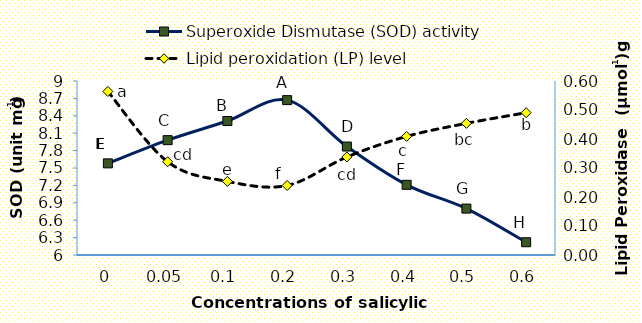
| Category | Superoxide Dismutase (SOD) activity  |
|---|---|
| 0.0 | 7.58 |
| 0.05 | 7.98 |
| 0.1 | 8.31 |
| 0.2 | 8.67 |
| 0.3 | 7.87 |
| 0.4 | 7.21 |
| 0.5 | 6.8 |
| 0.6 | 6.22 |